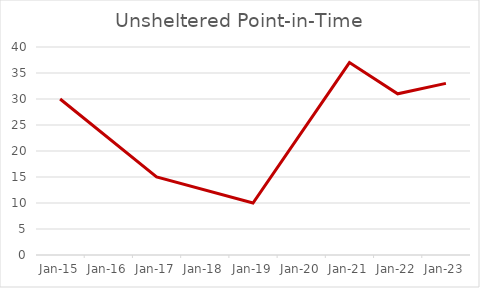
| Category | Total Persons |
|---|---|
| 2015-01-28 | 30 |
| 2017-01-25 | 15 |
| 2019-01-23 | 10 |
| 2021-01-27 | 37 |
| 2022-01-26 | 31 |
| 2023-01-25 | 33 |